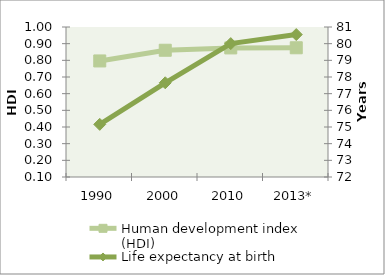
| Category | Human development index (HDI) |
|---|---|
| 1990 | 0.796 |
| 2000 | 0.861 |
| 2010 | 0.875 |
| 2013* | 0.875 |